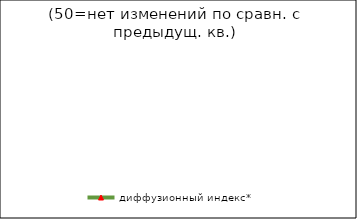
| Category | диффузионный индекс* |
|---|---|
| 2007-4 | 51.34 |
| 2008-1 | 51.725 |
| 2008-2 | 50.48 |
| 2008-3 | 51.275 |
| 2008-4 прогноз | 49.67 |